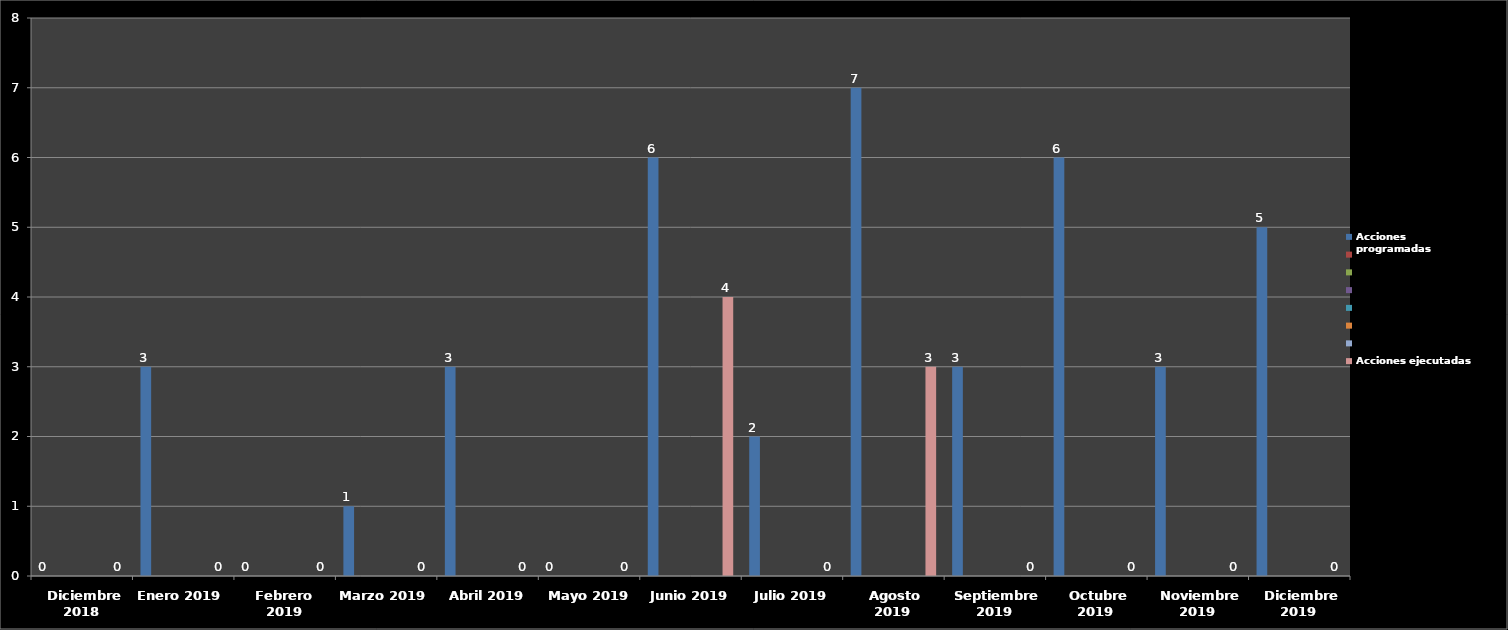
| Category | Acciones programadas | Series 1 | Series 2 | Series 3 | Series 4 | Series 5 | Series 6 | Acciones ejecutadas |
|---|---|---|---|---|---|---|---|---|
| 0 | 0 |  |  |  |  |  |  | 0 |
| 1 | 3 |  |  |  |  |  |  | 0 |
| 2 | 0 |  |  |  |  |  |  | 0 |
| 3 | 1 |  |  |  |  |  |  | 0 |
| 4 | 3 |  |  |  |  |  |  | 0 |
| 5 | 0 |  |  |  |  |  |  | 0 |
| 6 | 6 |  |  |  |  |  |  | 4 |
| 7 | 2 |  |  |  |  |  |  | 0 |
| 8 | 7 |  |  |  |  |  |  | 3 |
| 9 | 3 |  |  |  |  |  |  | 0 |
| 10 | 6 |  |  |  |  |  |  | 0 |
| 11 | 3 |  |  |  |  |  |  | 0 |
| 12 | 5 |  |  |  |  |  |  | 0 |